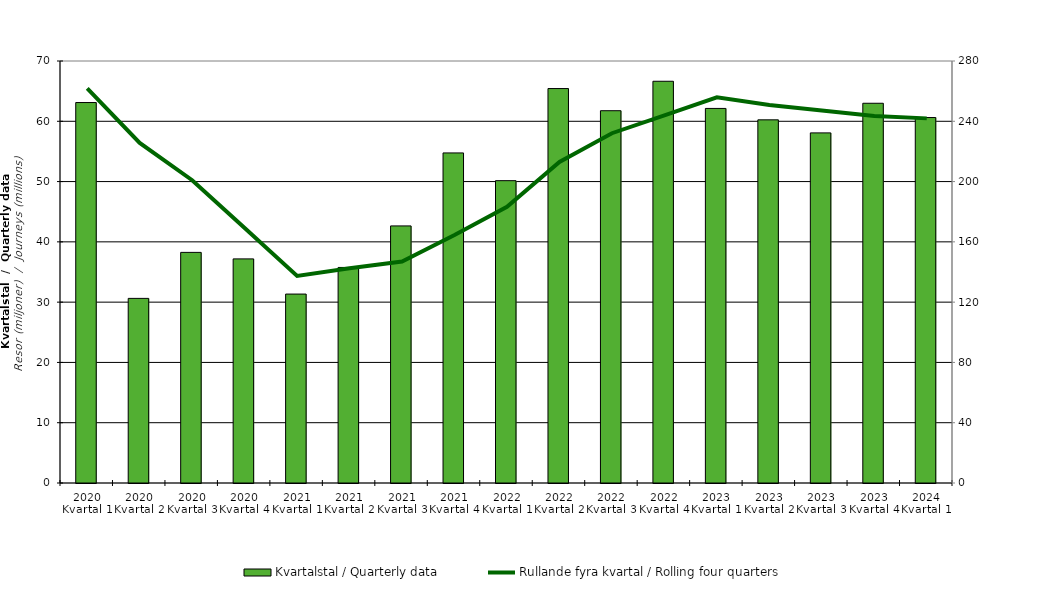
| Category | Kvartalstal / Quarterly data |
|---|---|
| 2020 Kvartal 1 | 63.109 |
| 2020 Kvartal 2 | 30.624 |
| 2020 Kvartal 3 | 38.255 |
| 2020 Kvartal 4 | 37.175 |
| 2021 Kvartal 1 | 31.339 |
| 2021 Kvartal 2 | 35.757 |
| 2021 Kvartal 3 | 42.645 |
| 2021 Kvartal 4 | 54.75 |
| 2022 Kvartal 1 | 50.15 |
| 2022 Kvartal 2 | 65.43 |
| 2022 Kvartal 3 | 61.753 |
| 2022 Kvartal 4 | 66.639 |
| 2023 Kvartal 1 | 62.134 |
| 2023 Kvartal 2 | 60.241 |
| 2023 Kvartal 3 | 58.077 |
| 2023 Kvartal 4 | 62.991 |
| 2024 Kvartal 1 | 60.623 |